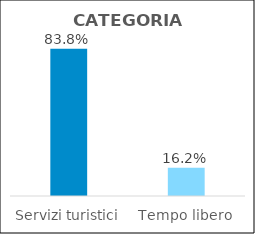
| Category | Series 0 |
|---|---|
| Servizi turistici | 0.838 |
| Tempo libero | 0.162 |